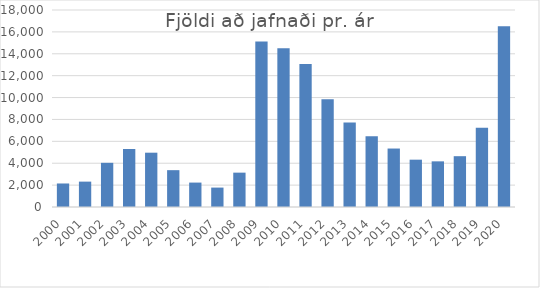
| Category | Allir |
|---|---|
| 2000.0 | 2149 |
| 2001.0 | 2319 |
| 2002.0 | 4037 |
| 2003.0 | 5299 |
| 2004.0 | 4962 |
| 2005.0 | 3366 |
| 2006.0 | 2231 |
| 2007.0 | 1774 |
| 2008.0 | 3139 |
| 2009.0 | 15121 |
| 2010.0 | 14503 |
| 2011.0 | 13066 |
| 2012.0 | 9838 |
| 2013.0 | 7726 |
| 2014.0 | 6474 |
| 2015.0 | 5342 |
| 2016.0 | 4324 |
| 2017.0 | 4171 |
| 2018.0 | 4643 |
| 2019.0 | 7238 |
| 2020.0 | 16522.5 |